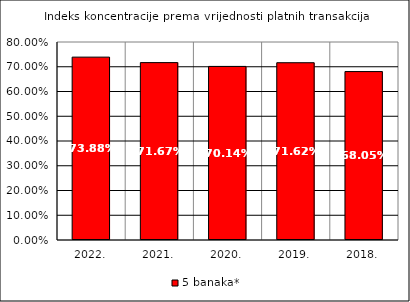
| Category | 5 banaka* |
|---|---|
| 2022. | 0.739 |
| 2021. | 0.717 |
| 2020. | 0.701 |
| 2019. | 0.716 |
| 2018. | 0.681 |